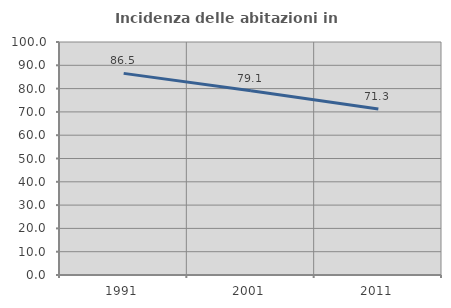
| Category | Incidenza delle abitazioni in proprietà  |
|---|---|
| 1991.0 | 86.538 |
| 2001.0 | 79.091 |
| 2011.0 | 71.287 |